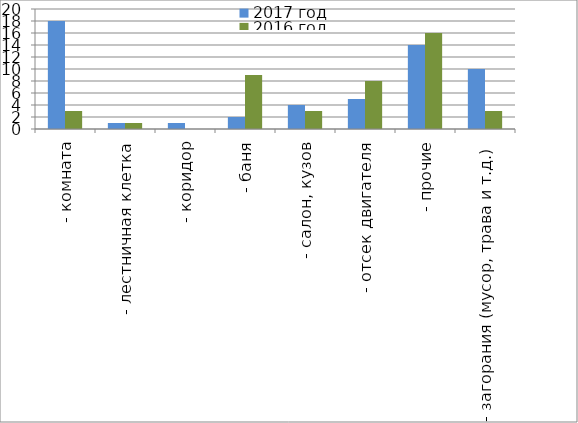
| Category | 2017 год | 2016 год |
|---|---|---|
|  - комната | 18 | 3 |
|  - лестничная клетка | 1 | 1 |
|  - коридор | 1 | 0 |
|  - баня | 2 | 9 |
|  - салон, кузов | 4 | 3 |
|  - отсек двигателя | 5 | 8 |
| - прочие | 14 | 16 |
| - загорания (мусор, трава и т.д.)  | 10 | 3 |